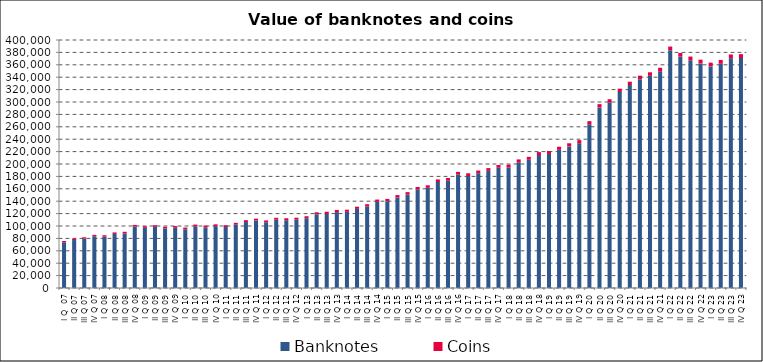
| Category | Banknotes | Coins |
|---|---|---|
| I Q  07 | 73727.412 | 2040.135 |
| II Q 07 | 77371.496 | 2137.582 |
| III Q 07 | 79578.46 | 2225.277 |
| IV Q 07 | 83364.627 | 2307.653 |
| I Q 08 | 82715.869 | 2358.844 |
| II Q 08 | 87199.402 | 2435.251 |
| III Q 08 | 88168.923 | 2486.825 |
| IV Q 08 | 99237.803 | 2536.169 |
| I Q 09 | 97049.999 | 2571.081 |
| II Q 09 | 98632.739 | 2665.517 |
| III Q 09 | 95957.726 | 2757.134 |
| IV Q 09 | 97177.286 | 2776.82 |
| I Q 10 | 94691.834 | 2724.082 |
| II Q 10 | 99506.937 | 2768.915 |
| III Q 10 | 97875.247 | 2839.031 |
| IV Q 10 | 99764.765 | 2898.294 |
| I Q 11 | 98447.013 | 2886.718 |
| II Q 11 | 102183.647 | 2953.775 |
| III Q 11 | 106395.997 | 3010.322 |
| IV Q 11 | 108786.226 | 3059.067 |
| I Q 12 | 105926.984 | 3068.322 |
| II Q 12 | 110104.057 | 3142.797 |
| III Q 12 | 109280.313 | 3206.567 |
| IV Q 12 | 110164.58 | 3250.066 |
| I Q 13 | 112501.146 | 3253.57 |
| II Q 13 | 118768.814 | 3307.219 |
| III Q 13 | 119650.391 | 3384.616 |
| IV Q 13 | 122428.908 | 3454.923 |
| I Q 14 | 122838.325 | 3474.731 |
| II Q 14 | 127576.392 | 3574.954 |
| III Q 14 | 131462.988 | 3655.159 |
| IV Q 14 | 138932.525 | 3728.511 |
| I Q 15 | 139935.731 | 3764.541 |
| II Q 15 | 146051.815 | 3849.431 |
| III Q 15 | 150682.665 | 3938.638 |
| IV Q 15 | 158921.701 | 4030.184 |
| I Q 16 | 161560.488 | 4078.052 |
| II Q 16 | 170939.931 | 4172.119 |
| III Q 16 | 173127.582 | 4249.831 |
| IV Q 16 | 182975.206 | 4319.775 |
| I Q 17 | 180684.736 | 4325.239 |
| II Q 17 | 185147.552 | 4351.953 |
| III Q 17 | 188987.001 | 4407.459 |
| IV Q 17 | 193950.164 | 4479.309 |
| I Q 18 | 194392.161 | 4516.342 |
| II Q 18 | 202788.928 | 4627.08 |
| III Q 18 | 206843.682 | 4711.715 |
| IV Q 18 | 214402.966 | 4795.229 |
| I Q 19 | 216181.618 | 4813.784 |
| II Q 19 | 222897.543 | 4944.402 |
| III Q 19 | 228417.354 | 5025.968 |
| IV Q 19 | 233356.103 | 5123.396 |
| I Q 20 | 263939.009 | 5154.408 |
| II Q 20 | 291310.398 | 5258.381 |
| III Q 20 | 299058.294 | 5360.578 |
| IV Q 20 | 316044.445 | 5451.705 |
| I Q 21 | 327277.158 | 5495.332 |
| II Q 21 | 336894.667 | 5596.566 |
| III Q 21 | 342223.08 | 5696.757 |
| IV Q 21 | 349462.845 | 5781.241 |
| I Q 22 | 383596.043 | 5816.66 |
| II Q 22 | 373112.805 | 5908.216 |
| III Q 22 | 367312.99 | 6005.546 |
| IV Q 22 | 362212.591 | 6076.251 |
| I Q 23 | 357418.456 | 6100.123 |
| II Q 23 | 361621.055 | 6204.148 |
| III Q 23 | 370372.24 | 6297.562 |
| IV Q 23 | 370808.245 | 6383.734 |